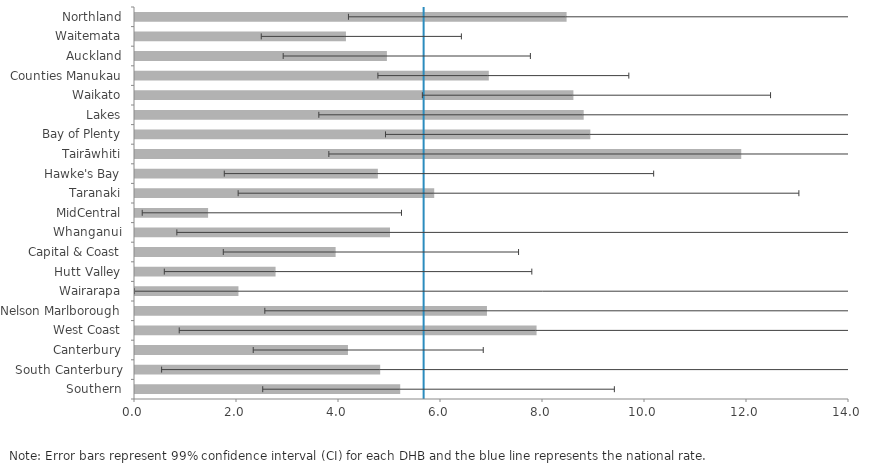
| Category | DHB |
|---|---|
| Northland | 8.463 |
| Waitemata | 4.136 |
| Auckland | 4.939 |
| Counties Manukau | 6.938 |
| Waikato | 8.596 |
| Lakes | 8.798 |
| Bay of Plenty | 8.929 |
| Tairāwhiti | 11.887 |
| Hawke's Bay | 4.762 |
| Taranaki | 5.867 |
| MidCentral | 1.433 |
| Whanganui | 5 |
| Capital & Coast | 3.934 |
| Hutt Valley | 2.756 |
| Wairarapa | 2.028 |
| Nelson Marlborough | 6.901 |
| West Coast | 7.874 |
| Canterbury | 4.176 |
| South Canterbury | 4.808 |
| Southern | 5.2 |